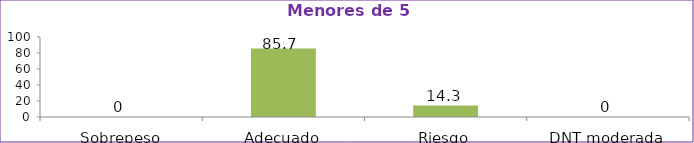
| Category | Series 0 |
|---|---|
| Sobrepeso | 0 |
| Adecuado | 85.7 |
| Riesgo | 14.3 |
| DNT moderada | 0 |